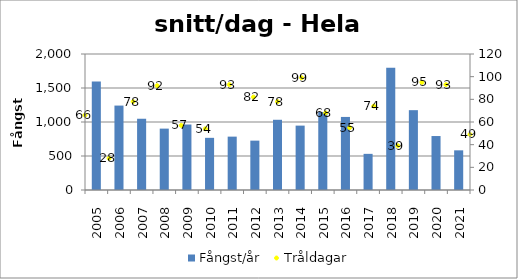
| Category | Fångst/år |
|---|---|
| 2005.0 | 1594.773 |
| 2006.0 | 1241.607 |
| 2007.0 | 1047.885 |
| 2008.0 | 902.663 |
| 2009.0 | 962.982 |
| 2010.0 | 767.13 |
| 2011.0 | 784.839 |
| 2012.0 | 725.976 |
| 2013.0 | 1032.679 |
| 2014.0 | 946.798 |
| 2015.0 | 1147.368 |
| 2016.0 | 1074.473 |
| 2017.0 | 531.568 |
| 2018.0 | 1797.692 |
| 2019.0 | 1174.053 |
| 2020.0 | 793.677 |
| 2021.0 | 583.367 |